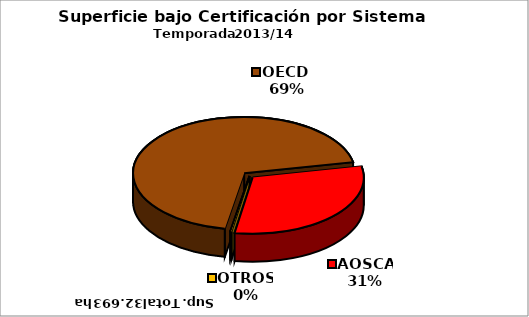
| Category | Series 0 |
|---|---|
| OECD  | 22575 |
| AOSCA | 10058 |
| OTROS | 60 |